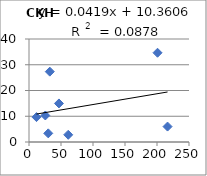
| Category | CKH g/kg |
|---|---|
| 25.5 | 10.3 |
| 61.3 | 2.8 |
| 11.7 | 9.67 |
| 216.5 | 5.99 |
| 46.8 | 14.97 |
| 32.5 | 27.32 |
| 200.8 | 34.66 |
| 30.1 | 3.36 |